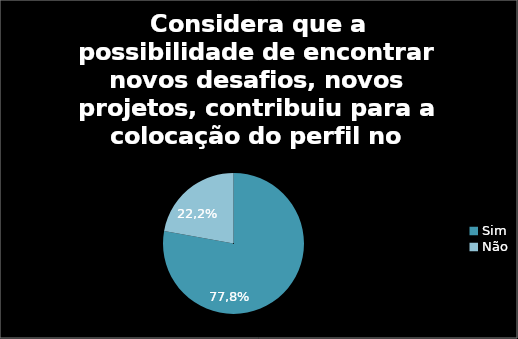
| Category | Considera que a possibilidade de encontrar novos desafios, novos projetos, contribuiu para a colocação do perfil no Linkedin |
|---|---|
| Sim | 77.838 |
| Não | 22.162 |